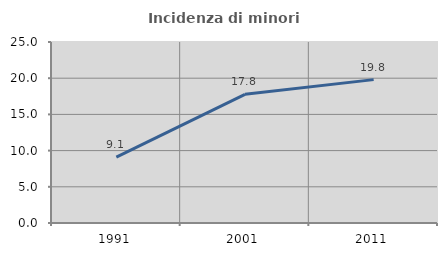
| Category | Incidenza di minori stranieri |
|---|---|
| 1991.0 | 9.091 |
| 2001.0 | 17.778 |
| 2011.0 | 19.802 |